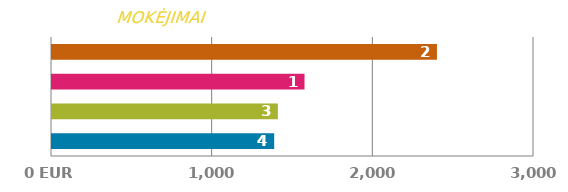
| Category | MOKĖJIMAS |
|---|---|
| 0 | 1382.921 |
| 1 | 1405.775 |
| 2 | 1571.655 |
| 3 | 2396.046 |